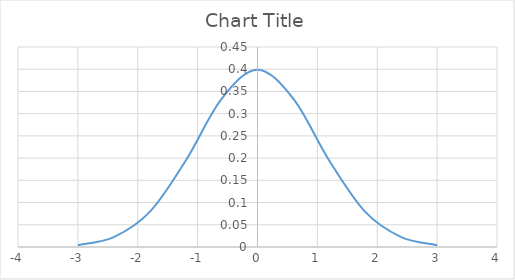
| Category | Series 0 |
|---|---|
| -3.0 | 0.004 |
| -2.4 | 0.022 |
| -1.7999999999999998 | 0.079 |
| -1.1999999999999997 | 0.194 |
| -0.5999999999999998 | 0.333 |
| 0.0 | 0.399 |
| 0.6 | 0.333 |
| 1.2 | 0.194 |
| 1.7999999999999998 | 0.079 |
| 2.4 | 0.022 |
| 3.0 | 0.004 |